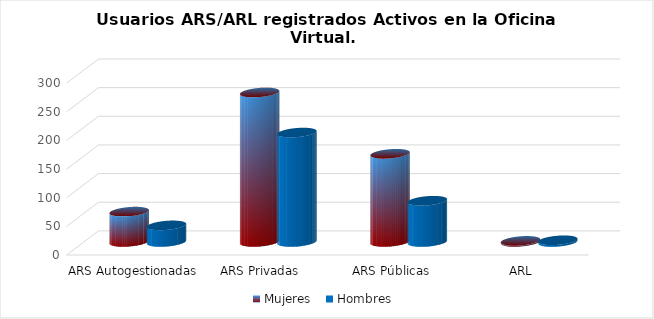
| Category | Mujeres | Hombres |
|---|---|---|
| ARS Autogestionadas | 53 | 29 |
| ARS Privadas | 261 | 191 |
| ARS Públicas | 154 | 72 |
| ARL | 2 | 3 |